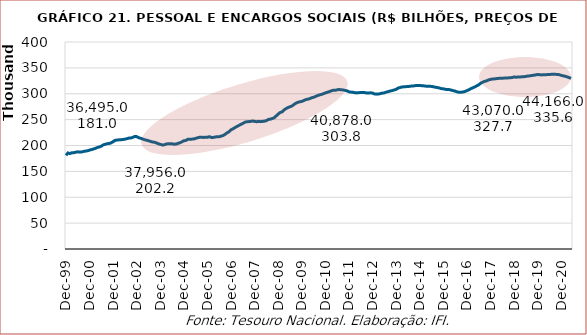
| Category | Series 0 |
|---|---|
| 1999-12-01 | 181008.507 |
| 2000-01-01 | 185606.579 |
| 2000-02-01 | 184400.001 |
| 2000-03-01 | 186102.104 |
| 2000-04-01 | 186178.397 |
| 2000-05-01 | 187082.466 |
| 2000-06-01 | 187765.717 |
| 2000-07-01 | 187299.128 |
| 2000-08-01 | 187620.806 |
| 2000-09-01 | 188546.057 |
| 2000-10-01 | 189215.265 |
| 2000-11-01 | 189814.217 |
| 2000-12-01 | 191137.96 |
| 2001-01-01 | 192092.849 |
| 2001-02-01 | 193321.253 |
| 2001-03-01 | 194427.875 |
| 2001-04-01 | 196273.182 |
| 2001-05-01 | 197212.125 |
| 2001-06-01 | 198745.909 |
| 2001-07-01 | 201217.204 |
| 2001-08-01 | 202359.474 |
| 2001-09-01 | 203514.176 |
| 2001-10-01 | 203917.759 |
| 2001-11-01 | 205219.239 |
| 2001-12-01 | 207401.657 |
| 2002-01-01 | 209972.16 |
| 2002-02-01 | 210535.255 |
| 2002-03-01 | 210943.916 |
| 2002-04-01 | 211138.979 |
| 2002-05-01 | 211610.642 |
| 2002-06-01 | 212227.606 |
| 2002-07-01 | 213167.211 |
| 2002-08-01 | 214280.303 |
| 2002-09-01 | 214361.71 |
| 2002-10-01 | 215752.702 |
| 2002-11-01 | 217481.955 |
| 2002-12-01 | 217162.951 |
| 2003-01-01 | 215059.436 |
| 2003-02-01 | 213964.144 |
| 2003-03-01 | 212580.285 |
| 2003-04-01 | 211052.13 |
| 2003-05-01 | 210252.462 |
| 2003-06-01 | 209136.827 |
| 2003-07-01 | 208020.546 |
| 2003-08-01 | 206652.404 |
| 2003-09-01 | 206379.236 |
| 2003-10-01 | 205006.547 |
| 2003-11-01 | 203405.572 |
| 2003-12-01 | 202203.14 |
| 2004-01-01 | 201010.262 |
| 2004-02-01 | 201293.069 |
| 2004-03-01 | 202961.245 |
| 2004-04-01 | 203309.59 |
| 2004-05-01 | 203538.534 |
| 2004-06-01 | 203398.522 |
| 2004-07-01 | 202332.187 |
| 2004-08-01 | 202866.823 |
| 2004-09-01 | 204110.227 |
| 2004-10-01 | 205307.919 |
| 2004-11-01 | 207124.139 |
| 2004-12-01 | 209148.754 |
| 2005-01-01 | 209700.507 |
| 2005-02-01 | 212027.295 |
| 2005-03-01 | 211845.425 |
| 2005-04-01 | 212290.725 |
| 2005-05-01 | 212629.469 |
| 2005-06-01 | 213773.284 |
| 2005-07-01 | 214974.919 |
| 2005-08-01 | 215850.93 |
| 2005-09-01 | 215993.359 |
| 2005-10-01 | 215559.741 |
| 2005-11-01 | 215965.979 |
| 2005-12-01 | 215818.991 |
| 2006-01-01 | 217049.527 |
| 2006-02-01 | 215512.302 |
| 2006-03-01 | 215639.347 |
| 2006-04-01 | 216421.169 |
| 2006-05-01 | 217123.373 |
| 2006-06-01 | 216979.194 |
| 2006-07-01 | 218185.377 |
| 2006-08-01 | 219319.352 |
| 2006-09-01 | 221669.166 |
| 2006-10-01 | 224538.729 |
| 2006-11-01 | 226496.846 |
| 2006-12-01 | 230285.151 |
| 2007-01-01 | 232211.207 |
| 2007-02-01 | 234704.563 |
| 2007-03-01 | 236727.275 |
| 2007-04-01 | 238775.309 |
| 2007-05-01 | 240826.62 |
| 2007-06-01 | 242635.911 |
| 2007-07-01 | 244972.103 |
| 2007-08-01 | 245978.185 |
| 2007-09-01 | 246138.243 |
| 2007-10-01 | 246561.4 |
| 2007-11-01 | 247294.975 |
| 2007-12-01 | 246549.163 |
| 2008-01-01 | 246008.65 |
| 2008-02-01 | 246412.769 |
| 2008-03-01 | 246081.245 |
| 2008-04-01 | 246495.114 |
| 2008-05-01 | 247070.998 |
| 2008-06-01 | 247967.946 |
| 2008-07-01 | 250376.932 |
| 2008-08-01 | 250979.46 |
| 2008-09-01 | 252119.66 |
| 2008-10-01 | 253715.83 |
| 2008-11-01 | 257235.063 |
| 2008-12-01 | 260792.557 |
| 2009-01-01 | 263807.393 |
| 2009-02-01 | 265091.42 |
| 2009-03-01 | 268825.383 |
| 2009-04-01 | 271354.065 |
| 2009-05-01 | 273297.105 |
| 2009-06-01 | 274916.073 |
| 2009-07-01 | 276320.708 |
| 2009-08-01 | 279264.007 |
| 2009-09-01 | 281654.836 |
| 2009-10-01 | 283474.134 |
| 2009-11-01 | 284498.354 |
| 2009-12-01 | 285232.867 |
| 2010-01-01 | 286874.913 |
| 2010-02-01 | 288616.319 |
| 2010-03-01 | 289466.821 |
| 2010-04-01 | 290452.989 |
| 2010-05-01 | 292323.429 |
| 2010-06-01 | 293161.671 |
| 2010-07-01 | 294762.89 |
| 2010-08-01 | 296522.155 |
| 2010-09-01 | 297619.503 |
| 2010-10-01 | 298809.375 |
| 2010-11-01 | 300100.951 |
| 2010-12-01 | 301597.571 |
| 2011-01-01 | 302847.17 |
| 2011-02-01 | 304106.521 |
| 2011-03-01 | 305620.883 |
| 2011-04-01 | 306704.504 |
| 2011-05-01 | 306674.408 |
| 2011-06-01 | 307565.746 |
| 2011-07-01 | 308219.292 |
| 2011-08-01 | 307633.113 |
| 2011-09-01 | 307373.914 |
| 2011-10-01 | 306477.551 |
| 2011-11-01 | 305577.536 |
| 2011-12-01 | 303765.899 |
| 2012-01-01 | 303172.636 |
| 2012-02-01 | 302988.319 |
| 2012-03-01 | 301923.019 |
| 2012-04-01 | 301657.04 |
| 2012-05-01 | 302041.55 |
| 2012-06-01 | 302577.145 |
| 2012-07-01 | 302445.028 |
| 2012-08-01 | 302275.211 |
| 2012-09-01 | 301466.645 |
| 2012-10-01 | 301435.769 |
| 2012-11-01 | 301875.835 |
| 2012-12-01 | 301157.776 |
| 2013-01-01 | 299578.199 |
| 2013-02-01 | 299257.853 |
| 2013-03-01 | 299377.34 |
| 2013-04-01 | 300343.031 |
| 2013-05-01 | 301194.344 |
| 2013-06-01 | 301740.404 |
| 2013-07-01 | 303189.775 |
| 2013-08-01 | 304146.492 |
| 2013-09-01 | 305288.616 |
| 2013-10-01 | 306149.848 |
| 2013-11-01 | 307276.206 |
| 2013-12-01 | 308524.852 |
| 2014-01-01 | 310904.461 |
| 2014-02-01 | 312103.252 |
| 2014-03-01 | 313024.057 |
| 2014-04-01 | 313487.861 |
| 2014-05-01 | 313750.325 |
| 2014-06-01 | 313832.356 |
| 2014-07-01 | 314507.127 |
| 2014-08-01 | 314906.872 |
| 2014-09-01 | 315222.073 |
| 2014-10-01 | 315819.294 |
| 2014-11-01 | 315776.027 |
| 2014-12-01 | 315941.581 |
| 2015-01-01 | 315594.833 |
| 2015-02-01 | 315271.21 |
| 2015-03-01 | 314740.841 |
| 2015-04-01 | 314612.717 |
| 2015-05-01 | 314409.607 |
| 2015-06-01 | 314200.789 |
| 2015-07-01 | 313404.005 |
| 2015-08-01 | 312644.872 |
| 2015-09-01 | 311991.737 |
| 2015-10-01 | 311167.993 |
| 2015-11-01 | 309939.899 |
| 2015-12-01 | 309566.297 |
| 2016-01-01 | 308597.888 |
| 2016-02-01 | 308172.92 |
| 2016-03-01 | 308019.515 |
| 2016-04-01 | 307101.595 |
| 2016-05-01 | 306017.988 |
| 2016-06-01 | 305141.594 |
| 2016-07-01 | 303638.046 |
| 2016-08-01 | 302875.871 |
| 2016-09-01 | 303011.439 |
| 2016-10-01 | 303312.582 |
| 2016-11-01 | 304340.373 |
| 2016-12-01 | 305926.771 |
| 2017-01-01 | 307718.06 |
| 2017-02-01 | 309753.338 |
| 2017-03-01 | 311400.167 |
| 2017-04-01 | 313217.603 |
| 2017-05-01 | 315166.631 |
| 2017-06-01 | 317251.723 |
| 2017-07-01 | 320217.105 |
| 2017-08-01 | 322316.548 |
| 2017-09-01 | 323888.126 |
| 2017-10-01 | 324914.719 |
| 2017-11-01 | 326648.757 |
| 2017-12-01 | 327659.118 |
| 2018-01-01 | 328574.372 |
| 2018-02-01 | 328662.541 |
| 2018-03-01 | 329225.033 |
| 2018-04-01 | 329700.257 |
| 2018-05-01 | 330183.449 |
| 2018-06-01 | 330051.392 |
| 2018-07-01 | 330279.509 |
| 2018-08-01 | 330593.959 |
| 2018-09-01 | 330649.958 |
| 2018-10-01 | 331048.716 |
| 2018-11-01 | 331217.981 |
| 2018-12-01 | 332493.031 |
| 2019-01-01 | 331938.392 |
| 2019-02-01 | 332356.189 |
| 2019-03-01 | 332448.675 |
| 2019-04-01 | 332704.587 |
| 2019-05-01 | 332938.328 |
| 2019-06-01 | 333490.222 |
| 2019-07-01 | 334231.421 |
| 2019-08-01 | 334573.484 |
| 2019-09-01 | 335200.72 |
| 2019-10-01 | 335866.014 |
| 2019-11-01 | 336428.817 |
| 2019-12-01 | 337184.158 |
| 2020-01-01 | 336690.868 |
| 2020-02-01 | 336425.703 |
| 2020-03-01 | 336591.635 |
| 2020-04-01 | 336726.294 |
| 2020-05-01 | 337066.544 |
| 2020-06-01 | 337099.923 |
| 2020-07-01 | 337594.195 |
| 2020-08-01 | 337700.249 |
| 2020-09-01 | 337569.3 |
| 2020-10-01 | 337279.749 |
| 2020-11-01 | 336858.469 |
| 2020-12-01 | 335614.034 |
| 2021-01-01 | 334576.659 |
| 2021-02-01 | 333830.378 |
| 2021-03-01 | 332578.485 |
| 2021-04-01 | 331265.3 |
| 2021-05-01 | 329612.009 |